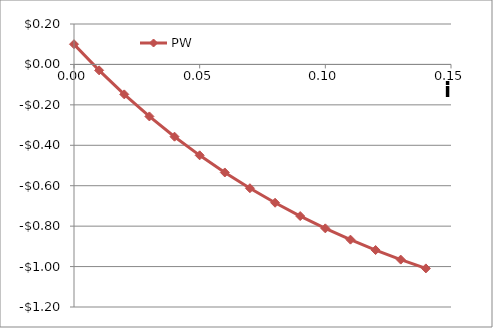
| Category | PW |
|---|---|
| 0.0 | 0.1 |
| 0.01 | -0.029 |
| 0.02 | -0.148 |
| 0.03 | -0.257 |
| 0.04 | -0.358 |
| 0.05 | -0.45 |
| 0.060000000000000005 | -0.534 |
| 0.07 | -0.612 |
| 0.08 | -0.684 |
| 0.09 | -0.75 |
| 0.09999999999999999 | -0.811 |
| 0.10999999999999999 | -0.867 |
| 0.11999999999999998 | -0.918 |
| 0.12999999999999998 | -0.966 |
| 0.13999999999999999 | -1.009 |